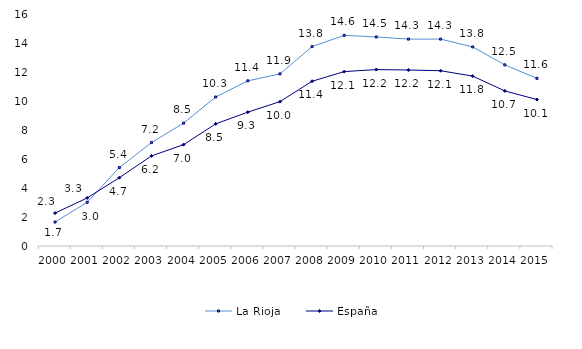
| Category | La Rioja | España |
|---|---|---|
| 2000.0 | 1.66 | 2.28 |
| 2001.0 | 3.03 | 3.33 |
| 2002.0 | 5.43 | 4.73 |
| 2003.0 | 7.16 | 6.24 |
| 2004.0 | 8.51 | 7.02 |
| 2005.0 | 10.32 | 8.46 |
| 2006.0 | 11.44 | 9.27 |
| 2007.0 | 11.92 | 10 |
| 2008.0 | 13.81 | 11.41 |
| 2009.0 | 14.59 | 12.08 |
| 2010.0 | 14.48 | 12.22 |
| 2011.0 | 14.33 | 12.19 |
| 2012.0 | 14.33 | 12.14 |
| 2013.0 | 13.789 | 11.768 |
| 2014.0 | 12.545 | 10.741 |
| 2015.0 | 11.612 | 10.144 |